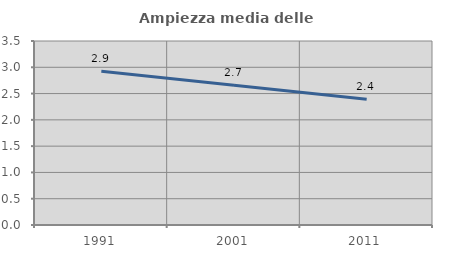
| Category | Ampiezza media delle famiglie |
|---|---|
| 1991.0 | 2.927 |
| 2001.0 | 2.657 |
| 2011.0 | 2.391 |